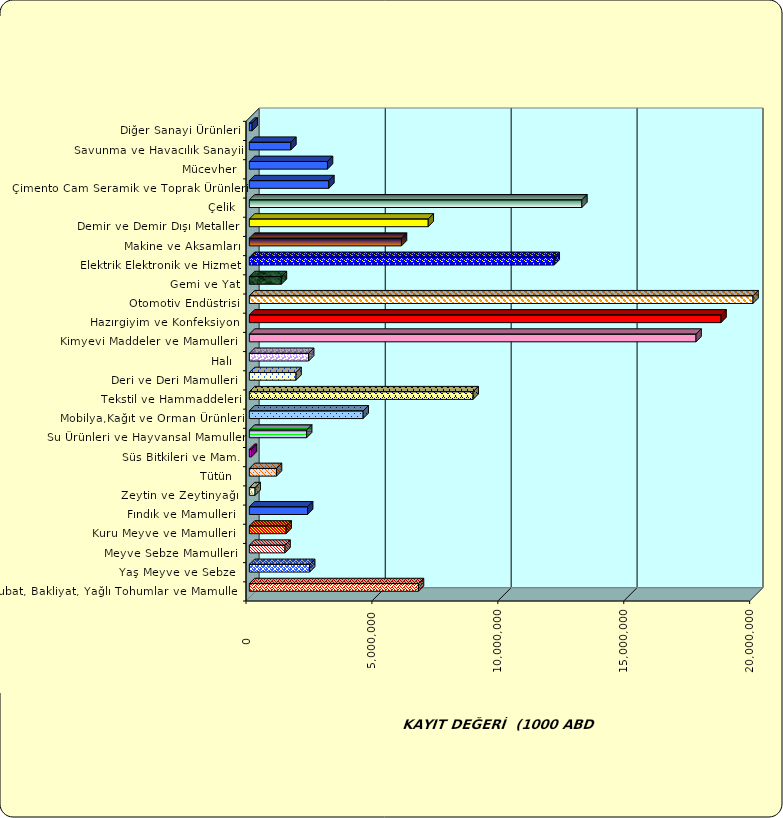
| Category | Series 0 |
|---|---|
|  Hububat, Bakliyat, Yağlı Tohumlar ve Mamulleri  | 6714803.537 |
|  Yaş Meyve ve Sebze   | 2394314.768 |
|  Meyve Sebze Mamulleri  | 1415614.873 |
|  Kuru Meyve ve Mamulleri   | 1458642.016 |
|  Fındık ve Mamulleri  | 2313236.627 |
|  Zeytin ve Zeytinyağı  | 228037.425 |
|  Tütün  | 1076772.753 |
|  Süs Bitkileri ve Mam. | 83034.162 |
|  Su Ürünleri ve Hayvansal Mamuller | 2274586.826 |
|  Mobilya,Kağıt ve Orman Ürünleri | 4518104.28 |
|  Tekstil ve Hammaddeleri | 8885006.884 |
|  Deri ve Deri Mamulleri  | 1853008.865 |
|  Halı  | 2354541.382 |
|  Kimyevi Maddeler ve Mamulleri   | 17736452.097 |
|  Hazırgiyim ve Konfeksiyon  | 18729250.058 |
|  Otomotiv Endüstrisi | 22269871.809 |
|  Gemi ve Yat | 1271865.951 |
|  Elektrik Elektronik ve Hizmet | 12105252.881 |
|  Makine ve Aksamları | 6040254.362 |
|  Demir ve Demir Dışı Metaller  | 7102735.468 |
|  Çelik | 13203683.201 |
|  Çimento Cam Seramik ve Toprak Ürünleri | 3156186.46 |
|  Mücevher | 3102495.085 |
|  Savunma ve Havacılık Sanayii | 1647798.565 |
|  Diğer Sanayi Ürünleri | 109919.168 |